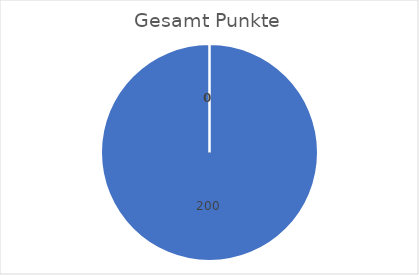
| Category | Gesamt Punkte |
|---|---|
| 0 | 0 |
| 1 | 200 |